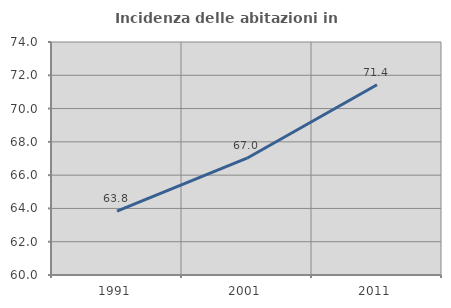
| Category | Incidenza delle abitazioni in proprietà  |
|---|---|
| 1991.0 | 63.843 |
| 2001.0 | 67.019 |
| 2011.0 | 71.433 |